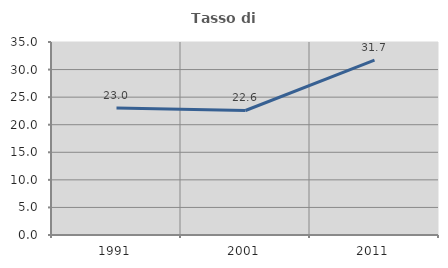
| Category | Tasso di occupazione   |
|---|---|
| 1991.0 | 23.046 |
| 2001.0 | 22.581 |
| 2011.0 | 31.707 |